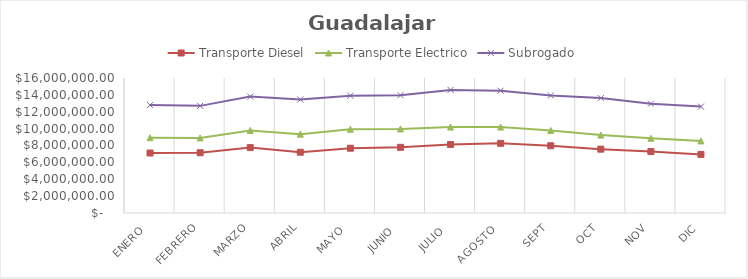
| Category | Transporte Diesel | Transporte Electrico | Subrogado |
|---|---|---|---|
| Enero  | 7107820.5 | 1815318 | 3864009 |
| Febrero | 7139683.5 | 1758420 | 3798517 |
| Marzo | 7748906 | 2036847.5 | 4008530 |
| Abril | 7202395 | 2138216.5 | 4114919 |
| Mayo  | 7677359 | 2245645.5 | 3969853 |
| Junio  | 7783307 | 2182425 | 4001515 |
| Julio  | 8115045.5 | 2069882.5 | 4404460 |
| Agosto  | 8252263.5 | 1934632 | 4310120 |
| Sept | 7967131.5 | 1809734.5 | 4152355 |
| Oct | 7567055.5 | 1667085 | 4385202 |
| Nov | 7280212.5 | 1575311.5 | 4103903 |
| Dic | 6942943.5 | 1599489.5 | 4065963 |